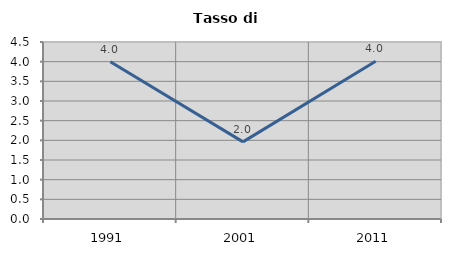
| Category | Tasso di disoccupazione   |
|---|---|
| 1991.0 | 4 |
| 2001.0 | 1.961 |
| 2011.0 | 4.011 |